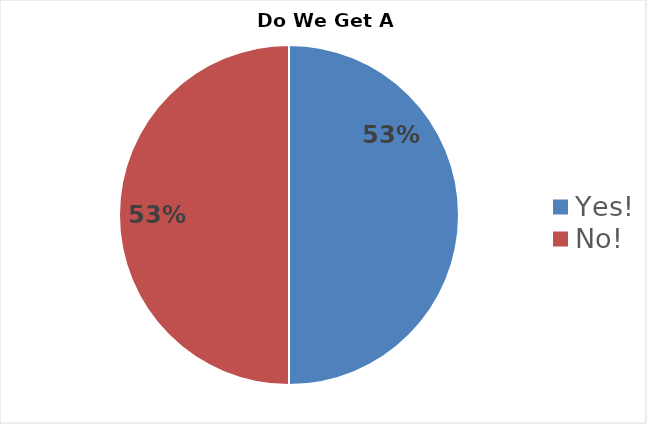
| Category | Series 0 |
|---|---|
| Yes! | 0.526 |
| No! | 0.526 |